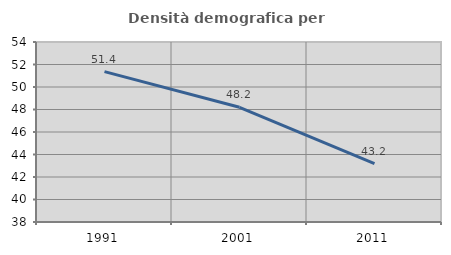
| Category | Densità demografica |
|---|---|
| 1991.0 | 51.37 |
| 2001.0 | 48.198 |
| 2011.0 | 43.195 |